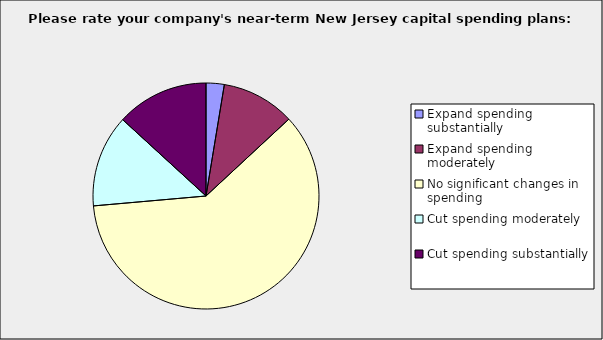
| Category | Series 0 |
|---|---|
| Expand spending substantially | 0.026 |
| Expand spending moderately | 0.105 |
| No significant changes in spending | 0.605 |
| Cut spending moderately | 0.132 |
| Cut spending substantially | 0.132 |